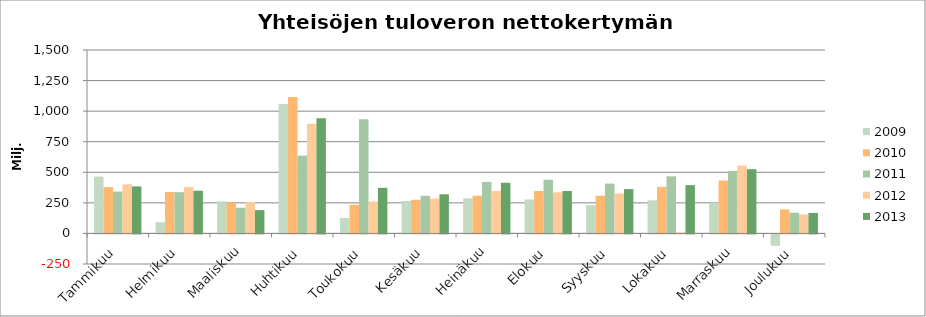
| Category | 2009 | 2010 | 2011 | 2012 | 2013 |
|---|---|---|---|---|---|
| Tammikuu | 464.899 | 378.86 | 341.987 | 401.627 | 384.485 |
| Helmikuu | 92.021 | 339.045 | 337.078 | 379.401 | 349.199 |
| Maaliskuu | 261.783 | 253.057 | 210.203 | 256.28 | 190.945 |
| Huhtikuu | 1059.201 | 1115.624 | 636.437 | 897.203 | 940.935 |
| Toukokuu | 126.163 | 234.756 | 933.434 | 262.244 | 372.901 |
| Kesäkuu | 265.105 | 274.88 | 307.856 | 285.13 | 320.319 |
| Heinäkuu | 286.978 | 308.391 | 421.522 | 347.389 | 414.27 |
| Elokuu | 277.363 | 347.548 | 439.399 | 335.795 | 347.137 |
| Syyskuu | 230.468 | 308.333 | 407.65 | 326.578 | 362.569 |
| Lokakuu | 270.56 | 380.508 | 466.894 | 9.04 | 394.905 |
| Marraskuu | 249.968 | 432.891 | 511.438 | 554.296 | 524.993 |
| Joulukuu | -92.536 | 196.924 | 169.141 | 155.44 | 167.693 |